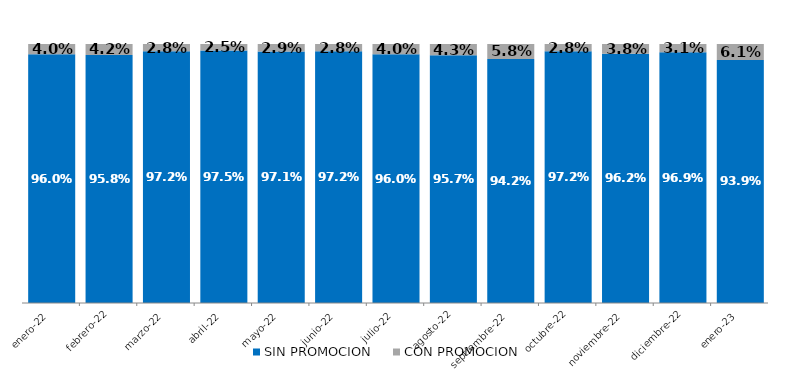
| Category | SIN PROMOCION   | CON PROMOCION   |
|---|---|---|
| 2022-01-01 | 0.96 | 0.04 |
| 2022-02-01 | 0.958 | 0.042 |
| 2022-03-01 | 0.972 | 0.028 |
| 2022-04-01 | 0.975 | 0.025 |
| 2022-05-01 | 0.971 | 0.029 |
| 2022-06-01 | 0.972 | 0.028 |
| 2022-07-01 | 0.96 | 0.04 |
| 2022-08-01 | 0.957 | 0.043 |
| 2022-09-01 | 0.942 | 0.058 |
| 2022-10-01 | 0.972 | 0.028 |
| 2022-11-01 | 0.962 | 0.038 |
| 2022-12-01 | 0.969 | 0.031 |
| 2023-01-01 | 0.939 | 0.061 |